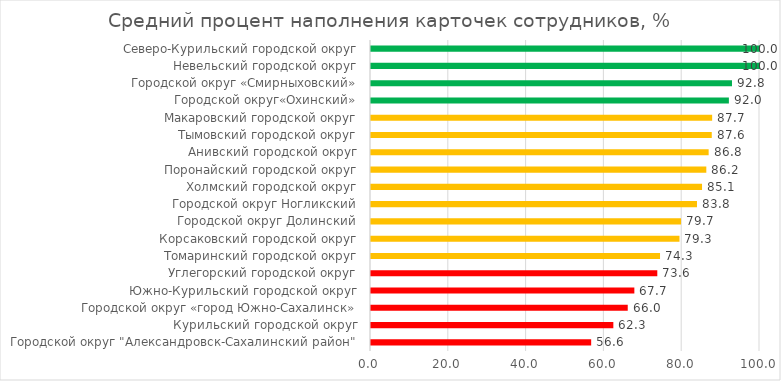
| Category | Средний процент наполнения карточек сотрудников, % |
|---|---|
| Городской округ "Александровск-Сахалинский район" | 56.6 |
| Курильский городской округ | 62.3 |
| Городской округ «город Южно-Сахалинск» | 66 |
| Южно-Курильский городской округ | 67.7 |
| Углегорский городской округ | 73.6 |
| Томаринский городской округ | 74.3 |
| Корсаковский городской округ | 79.3 |
| Городской округ Долинский | 79.7 |
| Городской округ Ногликский | 83.8 |
| Холмский городской округ | 85.1 |
| Поронайский городской округ | 86.2 |
| Анивский городской округ | 86.8 |
| Тымовский городской округ | 87.6 |
| Макаровский городской округ | 87.7 |
| Городской округ«Охинский» | 92 |
| Городской округ «Смирныховский» | 92.8 |
| Невельский городской округ | 100 |
| Северо-Курильский городской округ | 100 |